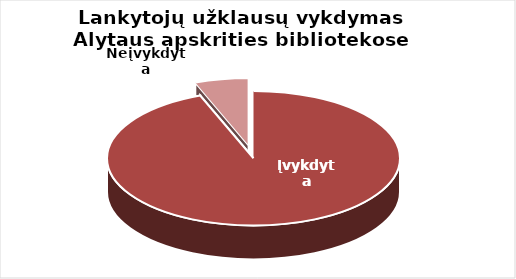
| Category | Series 0 |
|---|---|
| Įvykdyta | 25762 |
| Neįvykdyta | 1623 |